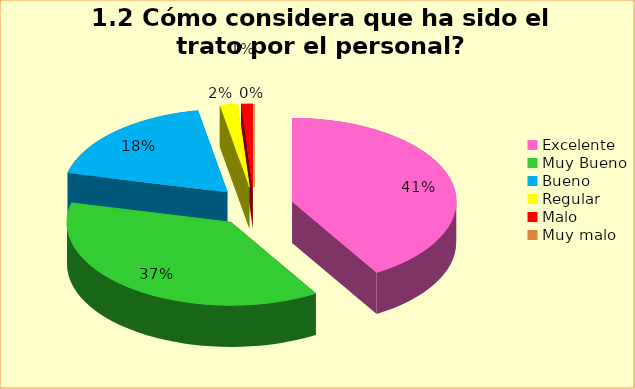
| Category | Series 0 |
|---|---|
| Excelente | 0.414 |
| Muy Bueno | 0.374 |
| Bueno  | 0.184 |
| Regular  | 0.017 |
| Malo  | 0.011 |
| Muy malo  | 0 |